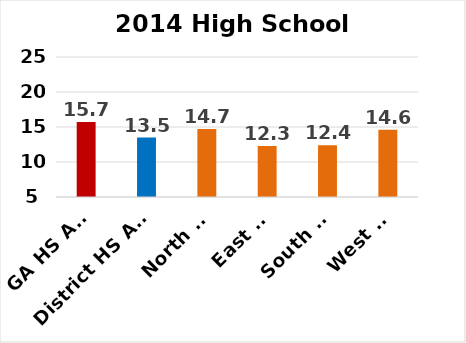
| Category | SGPs |
|---|---|
| GA HS Avg | 15.7 |
| District HS Avg | 13.5 |
| North HS | 14.7 |
| East HS | 12.3 |
| South HS | 12.4 |
| West HS | 14.6 |